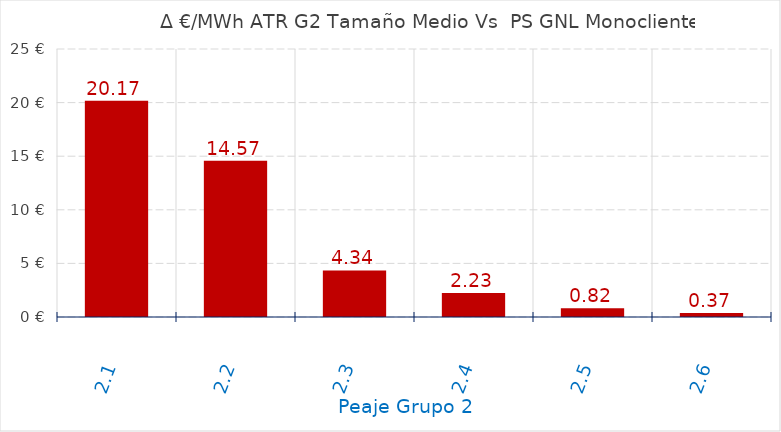
| Category | D €/MWh |
|---|---|
| 2.1 | 20.169 |
| 2.2 | 14.565 |
| 2.3 | 4.341 |
| 2.4 | 2.235 |
| 2.5 | 0.822 |
| 2.6 | 0.37 |